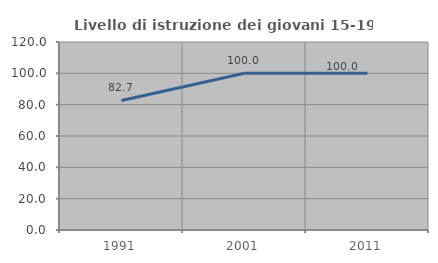
| Category | Livello di istruzione dei giovani 15-19 anni |
|---|---|
| 1991.0 | 82.692 |
| 2001.0 | 100 |
| 2011.0 | 100 |